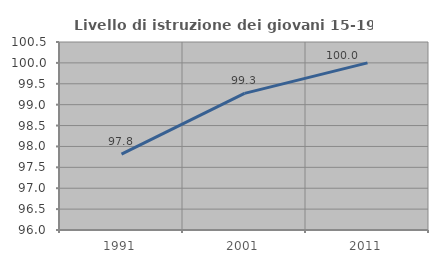
| Category | Livello di istruzione dei giovani 15-19 anni |
|---|---|
| 1991.0 | 97.814 |
| 2001.0 | 99.27 |
| 2011.0 | 100 |